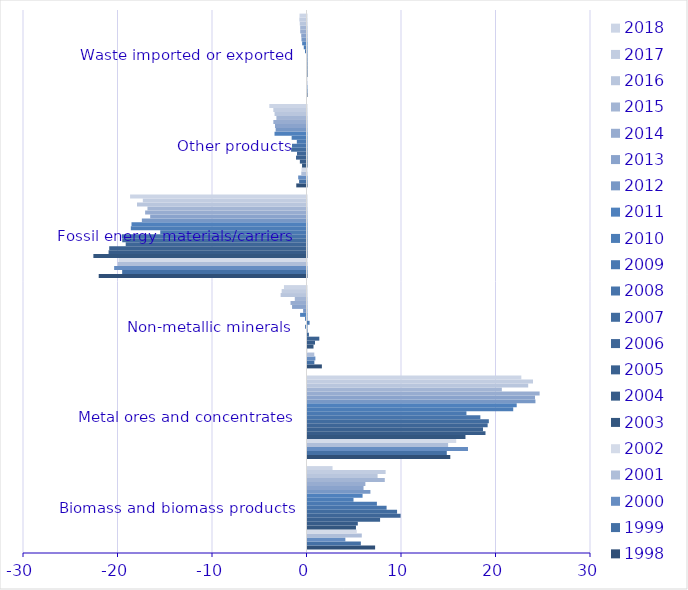
| Category | 1998 | 1999 | 2000 | 2001 | 2002 | 2003 | 2004 | 2005 | 2006 | 2007 | 2008 | 2009 | 2010 | 2011 | 2012 | 2013 | 2014 | 2015 | 2016 | 2017 | 2018 |
|---|---|---|---|---|---|---|---|---|---|---|---|---|---|---|---|---|---|---|---|---|---|
| Biomass and biomass products | 7.155 | 5.646 | 4.006 | 5.745 | 5.214 | 5.129 | 5.324 | 7.68 | 9.854 | 9.479 | 8.37 | 7.344 | 4.868 | 5.828 | 6.657 | 5.93 | 6.124 | 8.178 | 7.418 | 8.266 | 2.651 |
| Metal ores and concentrates | 15.11 | 14.74 | 16.983 | 14.88 | 15.735 | 16.716 | 18.835 | 18.572 | 19.062 | 19.19 | 18.291 | 16.819 | 21.769 | 22.139 | 24.122 | 24.076 | 24.563 | 20.564 | 23.355 | 23.862 | 22.627 |
| Non-metallic minerals | 1.521 | 0.726 | 0.835 | 0.719 | -0.034 | 0.636 | 0.795 | 1.249 | 0.15 | 0.005 | -0.148 | 0.223 | -0.152 | -0.679 | -0.36 | -1.529 | -1.692 | -1.239 | -2.738 | -2.63 | -2.386 |
| Fossil energy materials/carriers | -21.988 | -19.506 | -20.354 | -19.978 | -19.893 | -22.552 | -20.945 | -20.876 | -19.131 | -19.5 | -19.543 | -15.474 | -18.591 | -18.518 | -17.422 | -16.543 | -17.077 | -16.83 | -17.935 | -17.319 | -18.668 |
| Other products | -1.083 | -0.784 | -0.882 | -0.553 | -0.531 | -0.472 | -0.702 | -1.108 | -1.006 | -1.629 | -1.537 | -1.024 | -1.573 | -3.384 | -3.263 | -3.334 | -3.507 | -3.187 | -3.379 | -3.511 | -3.934 |
| Waste imported or exported | 0 | 0 | 0 | 0 | -0.002 | -0.002 | -0.002 | -0.017 | -0.008 | -0.013 | -0.027 | -0.156 | -0.29 | -0.46 | -0.534 | -0.56 | -0.667 | -0.671 | -0.712 | -0.756 | -0.737 |